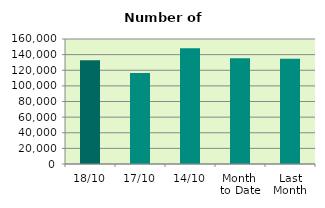
| Category | Series 0 |
|---|---|
| 18/10 | 132730 |
| 17/10 | 116590 |
| 14/10 | 148166 |
| Month 
to Date | 135352.167 |
| Last
Month | 134880 |